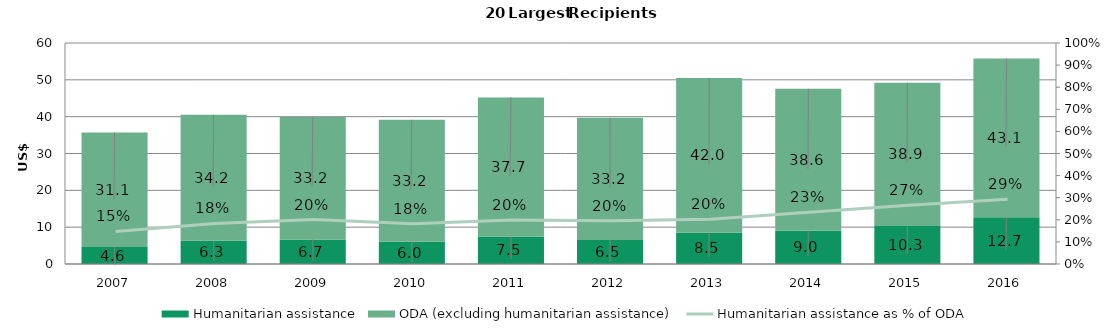
| Category | Humanitarian assistance | ODA (excluding humanitarian assistance) |
|---|---|---|
| 2007.0 | 4.592 | 31.134 |
| 2008.0 | 6.282 | 34.231 |
| 2009.0 | 6.675 | 33.208 |
| 2010.0 | 6.026 | 33.162 |
| 2011.0 | 7.5 | 37.73 |
| 2012.0 | 6.484 | 33.2 |
| 2013.0 | 8.493 | 42.023 |
| 2014.0 | 9.016 | 38.586 |
| 2015.0 | 10.327 | 38.876 |
| 2016.0 | 12.661 | 43.137 |